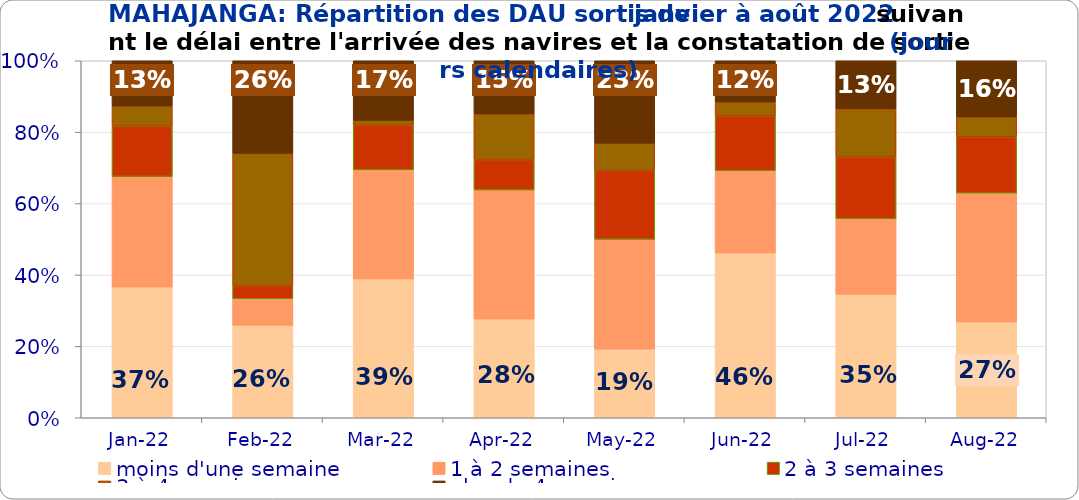
| Category | moins d'une semaine | 1 à 2 semaines | 2 à 3 semaines | 3 à 4 semaines | plus de 4 semaines |
|---|---|---|---|---|---|
| 2022-01-01 | 0.366 | 0.31 | 0.141 | 0.056 | 0.127 |
| 2022-02-01 | 0.259 | 0.074 | 0.037 | 0.37 | 0.259 |
| 2022-03-01 | 0.389 | 0.306 | 0.125 | 0.014 | 0.167 |
| 2022-04-01 | 0.277 | 0.362 | 0.085 | 0.128 | 0.149 |
| 2022-05-01 | 0.192 | 0.308 | 0.192 | 0.077 | 0.231 |
| 2022-06-01 | 0.462 | 0.231 | 0.154 | 0.038 | 0.115 |
| 2022-07-01 | 0.346 | 0.212 | 0.173 | 0.135 | 0.135 |
| 2022-08-01 | 0.269 | 0.361 | 0.157 | 0.056 | 0.157 |